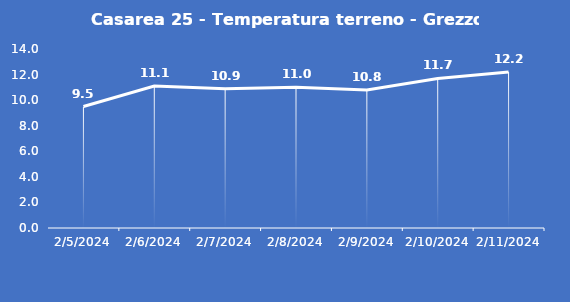
| Category | Casarea 25 - Temperatura terreno - Grezzo (°C) |
|---|---|
| 2/5/24 | 9.5 |
| 2/6/24 | 11.1 |
| 2/7/24 | 10.9 |
| 2/8/24 | 11 |
| 2/9/24 | 10.8 |
| 2/10/24 | 11.7 |
| 2/11/24 | 12.2 |